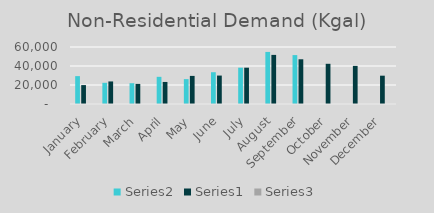
| Category | Series 1 | Series 0 | Series 2 |
|---|---|---|---|
| January | 29345 | 19908 | 1.474 |
| February | 22317.599 | 23745 | 0.94 |
| March | 21887.421 | 21154 | 1.035 |
| April | 28601.111 | 23203.745 | 1.233 |
| May | 26182.77 | 29574.268 | 0.885 |
| June | 33454.234 | 29931.133 | 1.118 |
| July | 38220.373 | 38220.373 | 1 |
| August | 54807.464 | 51691.008 | 1.06 |
| September | 51486.556 | 47078.323 | 1.094 |
| October | 0 | 42320.849 | 0 |
| November | 0 | 40123.835 | 0 |
| December | 0 | 29804.055 | 0 |